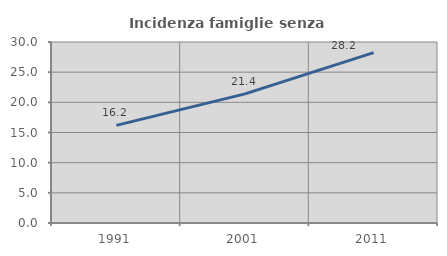
| Category | Incidenza famiglie senza nuclei |
|---|---|
| 1991.0 | 16.175 |
| 2001.0 | 21.405 |
| 2011.0 | 28.242 |